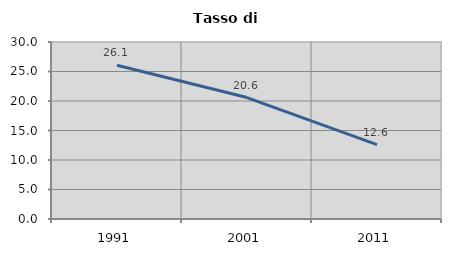
| Category | Tasso di disoccupazione   |
|---|---|
| 1991.0 | 26.052 |
| 2001.0 | 20.584 |
| 2011.0 | 12.616 |